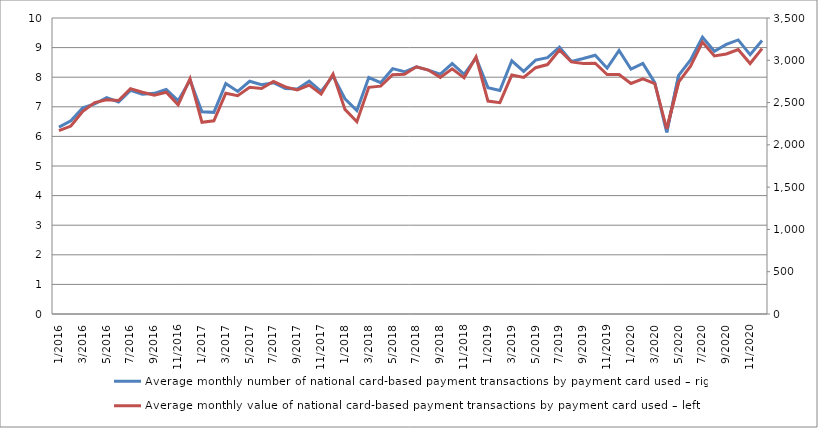
| Category | Average monthly number of national card-based payment transactions by payment card used – right |
|---|---|
| 1/2016 | 6.312 |
| 2/2016 | 6.53 |
| 3/2016 | 6.962 |
| 4/2016 | 7.096 |
| 5/2016 | 7.307 |
| 6/2016 | 7.161 |
| 7/2016 | 7.554 |
| 8/2016 | 7.425 |
| 9/2016 | 7.454 |
| 10/2016 | 7.583 |
| 11/2016 | 7.206 |
| 12/2016 | 7.898 |
| 1/2017 | 6.83 |
| 2/2017 | 6.812 |
| 3/2017 | 7.784 |
| 4/2017 | 7.52 |
| 5/2017 | 7.863 |
| 6/2017 | 7.746 |
| 7/2017 | 7.813 |
| 8/2017 | 7.618 |
| 9/2017 | 7.6 |
| 10/2017 | 7.866 |
| 11/2017 | 7.52 |
| 12/2017 | 8.044 |
| 1/2018 | 7.27 |
| 2/2018 | 6.875 |
| 3/2018 | 7.986 |
| 4/2018 | 7.816 |
| 5/2018 | 8.289 |
| 6/2018 | 8.183 |
| 7/2018 | 8.35 |
| 8/2018 | 8.239 |
| 9/2018 | 8.104 |
| 10/2018 | 8.459 |
| 11/2018 | 8.096 |
| 12/2018 | 8.656 |
| 1/2019 | 7.648 |
| 2/2019 | 7.548 |
| 3/2019 | 8.554 |
| 4/2019 | 8.197 |
| 5/2019 | 8.576 |
| 6/2019 | 8.661 |
| 7/2019 | 9.012 |
| 8/2019 | 8.536 |
| 9/2019 | 8.63 |
| 10/2019 | 8.741 |
| 11/2019 | 8.304 |
| 12/2019 | 8.901 |
| 1/2020 | 8.276 |
| 2/2020 | 8.467 |
| 3/2020 | 7.817 |
| 4/2020 | 6.137 |
| 5/2020 | 8.059 |
| 6/2020 | 8.586 |
| 7/2020 | 9.352 |
| 8/2020 | 8.878 |
| 9/2020 | 9.111 |
| 10/2020 | 9.259 |
| 11/2020 | 8.761 |
| 12/2020 | 9.241 |